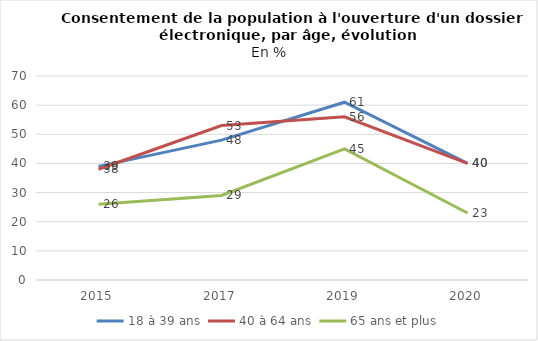
| Category | 18 à 39 ans | 40 à 64 ans | 65 ans et plus |
|---|---|---|---|
| 2015.0 | 39 | 38 | 26 |
| 2017.0 | 48 | 53 | 29 |
| 2019.0 | 61 | 56 | 45 |
| 2020.0 | 40 | 40 | 23 |